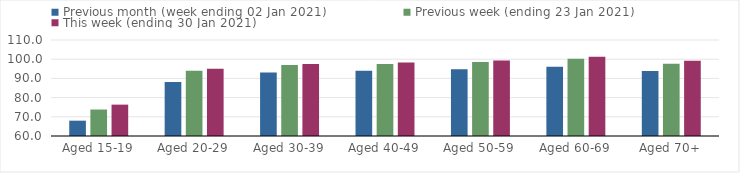
| Category | Previous month (week ending 02 Jan 2021) | Previous week (ending 23 Jan 2021) | This week (ending 30 Jan 2021) |
|---|---|---|---|
| Aged 15-19 | 67.98 | 73.79 | 76.34 |
| Aged 20-29 | 88.12 | 93.97 | 95.04 |
| Aged 30-39 | 93.11 | 96.92 | 97.55 |
| Aged 40-49 | 94.02 | 97.53 | 98.26 |
| Aged 50-59 | 94.77 | 98.49 | 99.34 |
| Aged 60-69 | 96.09 | 100.18 | 101.28 |
| Aged 70+ | 93.91 | 97.69 | 99.23 |